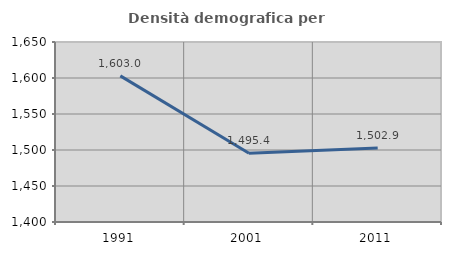
| Category | Densità demografica |
|---|---|
| 1991.0 | 1602.981 |
| 2001.0 | 1495.441 |
| 2011.0 | 1502.886 |